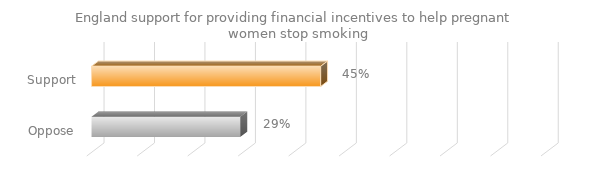
| Category | England support for providing financial incentives to help pregnant women stop smoking |
|---|---|
| Support | 0.454 |
| Oppose | 0.295 |